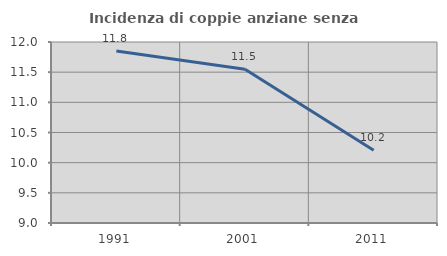
| Category | Incidenza di coppie anziane senza figli  |
|---|---|
| 1991.0 | 11.85 |
| 2001.0 | 11.549 |
| 2011.0 | 10.204 |